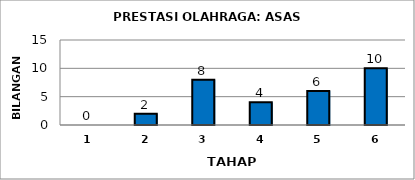
| Category | Series 0 |
|---|---|
| 1.0 | 0 |
| 2.0 | 2 |
| 3.0 | 8 |
| 4.0 | 4 |
| 5.0 | 6 |
| 6.0 | 10 |